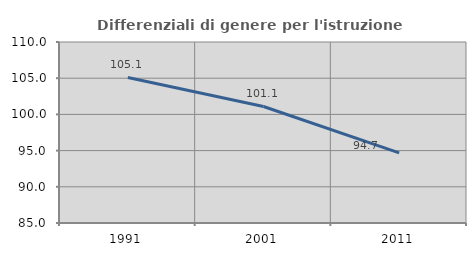
| Category | Differenziali di genere per l'istruzione superiore |
|---|---|
| 1991.0 | 105.099 |
| 2001.0 | 101.093 |
| 2011.0 | 94.696 |